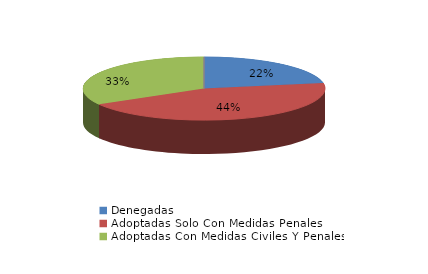
| Category | Series 0 |
|---|---|
| Denegadas | 2 |
| Adoptadas Solo Con Medidas Penales | 4 |
| Adoptadas Con Medidas Civiles Y Penales | 3 |
| Adoptadas Con Medidas Solo Civiles | 0 |